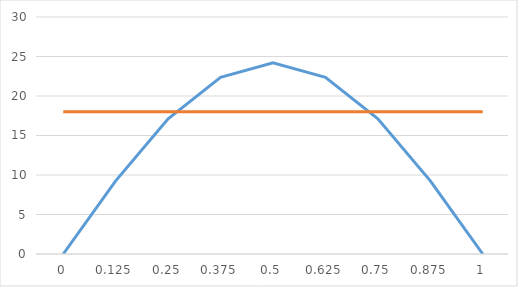
| Category | Series 0 | Series 1 |
|---|---|---|
| 0.0 | 0 | 18 |
| 0.125 | 9.261 | 18 |
| 0.25 | 17.112 | 18 |
| 0.37500000000000006 | 22.357 | 18 |
| 0.5 | 24.199 | 18 |
| 0.625 | 22.357 | 18 |
| 0.7500000000000001 | 17.112 | 18 |
| 0.875 | 9.261 | 18 |
| 1.0 | 0 | 18 |